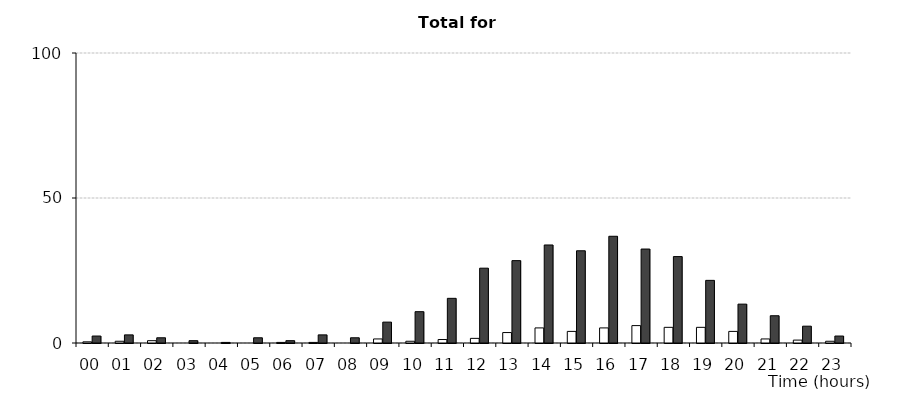
| Category | Series 1 | Series 2 |
|---|---|---|
| 00 | 0.4 | 2.4 |
| 01 | 0.6 | 2.8 |
| 02 | 0.8 | 1.8 |
| 03 | 0 | 0.8 |
| 04 | 0 | 0.2 |
| 05 | 0 | 1.8 |
| 06 | 0.2 | 0.8 |
| 07 | 0.2 | 2.8 |
| 08 | 0 | 1.8 |
| 09 | 1.4 | 7.2 |
| 10 | 0.6 | 10.8 |
| 11 | 1.2 | 15.4 |
| 12 | 1.6 | 25.8 |
| 13 | 3.6 | 28.4 |
| 14 | 5.2 | 33.8 |
| 15 | 4 | 31.8 |
| 16 | 5.2 | 36.8 |
| 17 | 6 | 32.4 |
| 18 | 5.4 | 29.8 |
| 19 | 5.4 | 21.6 |
| 20 | 4 | 13.4 |
| 21 | 1.4 | 9.4 |
| 22 | 1 | 5.8 |
| 23 | 0.6 | 2.4 |